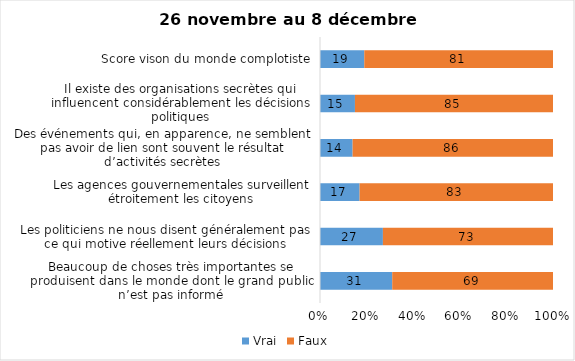
| Category | Vrai | Faux |
|---|---|---|
| Beaucoup de choses très importantes se produisent dans le monde dont le grand public n’est pas informé | 31 | 69 |
| Les politiciens ne nous disent généralement pas ce qui motive réellement leurs décisions | 27 | 73 |
| Les agences gouvernementales surveillent étroitement les citoyens | 17 | 83 |
| Des événements qui, en apparence, ne semblent pas avoir de lien sont souvent le résultat d’activités secrètes | 14 | 86 |
| Il existe des organisations secrètes qui influencent considérablement les décisions politiques | 15 | 85 |
| Score vison du monde complotiste | 19 | 81 |